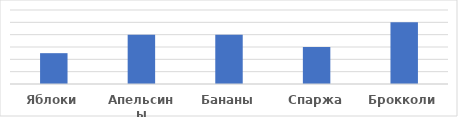
| Category | Количество |
|---|---|
| Яблоки | 500 |
| Апельсины | 800 |
| Бананы | 800 |
| Спаржа | 600 |
| Брокколи | 1000 |